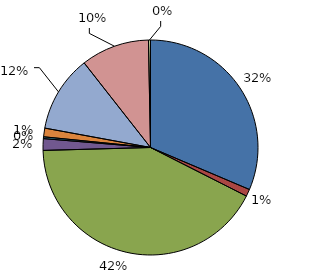
| Category | DIHR |
|---|---|
| Eau | 1826526351 |
| Aménagement de Zones, Lotissement, Ateliers | 62281883 |
| Économie | 2449903822 |
| Tourisme-Culture-Sport | 102170410 |
| Santé-Social | 15785804 |
| Scolaire | 75680785 |
| Transport | 670501044 |
| Ordures | 598416544 |
| Administration | 17547995 |